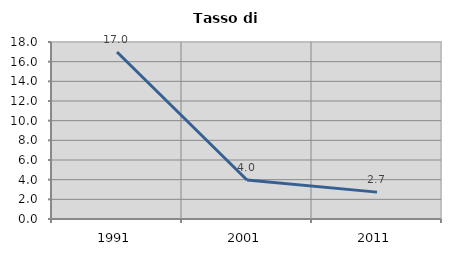
| Category | Tasso di disoccupazione   |
|---|---|
| 1991.0 | 16.979 |
| 2001.0 | 3.963 |
| 2011.0 | 2.733 |